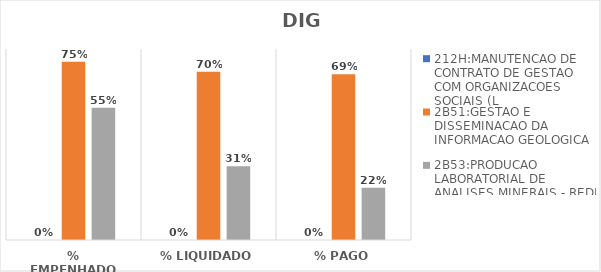
| Category | 212H:MANUTENCAO DE CONTRATO DE GESTAO COM ORGANIZACOES SOCIAIS (L | 2B51:GESTAO E DISSEMINACAO DA INFORMACAO GEOLOGICA | 2B53:PRODUCAO LABORATORIAL DE ANALISES MINERAIS - REDE LAMIN |
|---|---|---|---|
| % EMPENHADO | 0 | 0.746 | 0.554 |
| % LIQUIDADO | 0 | 0.705 | 0.309 |
| % PAGO | 0 | 0.694 | 0.219 |